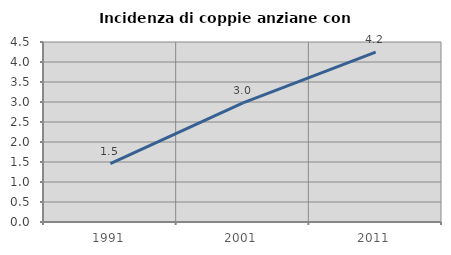
| Category | Incidenza di coppie anziane con figli |
|---|---|
| 1991.0 | 1.461 |
| 2001.0 | 2.977 |
| 2011.0 | 4.247 |